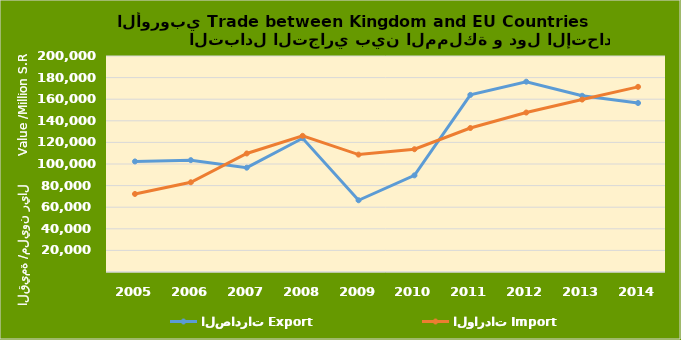
| Category | الصادرات | الواردات |
|---|---|---|
| 2005.0 | 102360884129 | 72269442378 |
| 2006.0 | 103563173654 | 83079783957 |
| 2007.0 | 96589567347 | 109742020646 |
| 2008.0 | 123842358569 | 126076788324 |
| 2009.0 | 66424449943 | 108706870724 |
| 2010.0 | 89473272822 | 113673694057 |
| 2011.0 | 163984710171 | 133338217916 |
| 2012.0 | 176214374025 | 147655229181 |
| 2013.0 | 163153758917 | 159668962902 |
| 2014.0 | 156468256094 | 171440173149 |